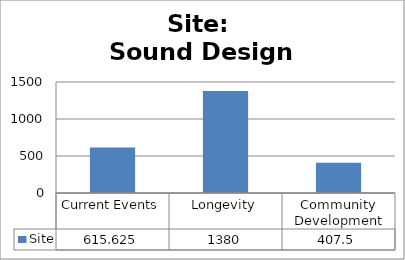
| Category | Site |
|---|---|
| Current Events | 615.625 |
| Longevity | 1380 |
| Community Development | 407.5 |